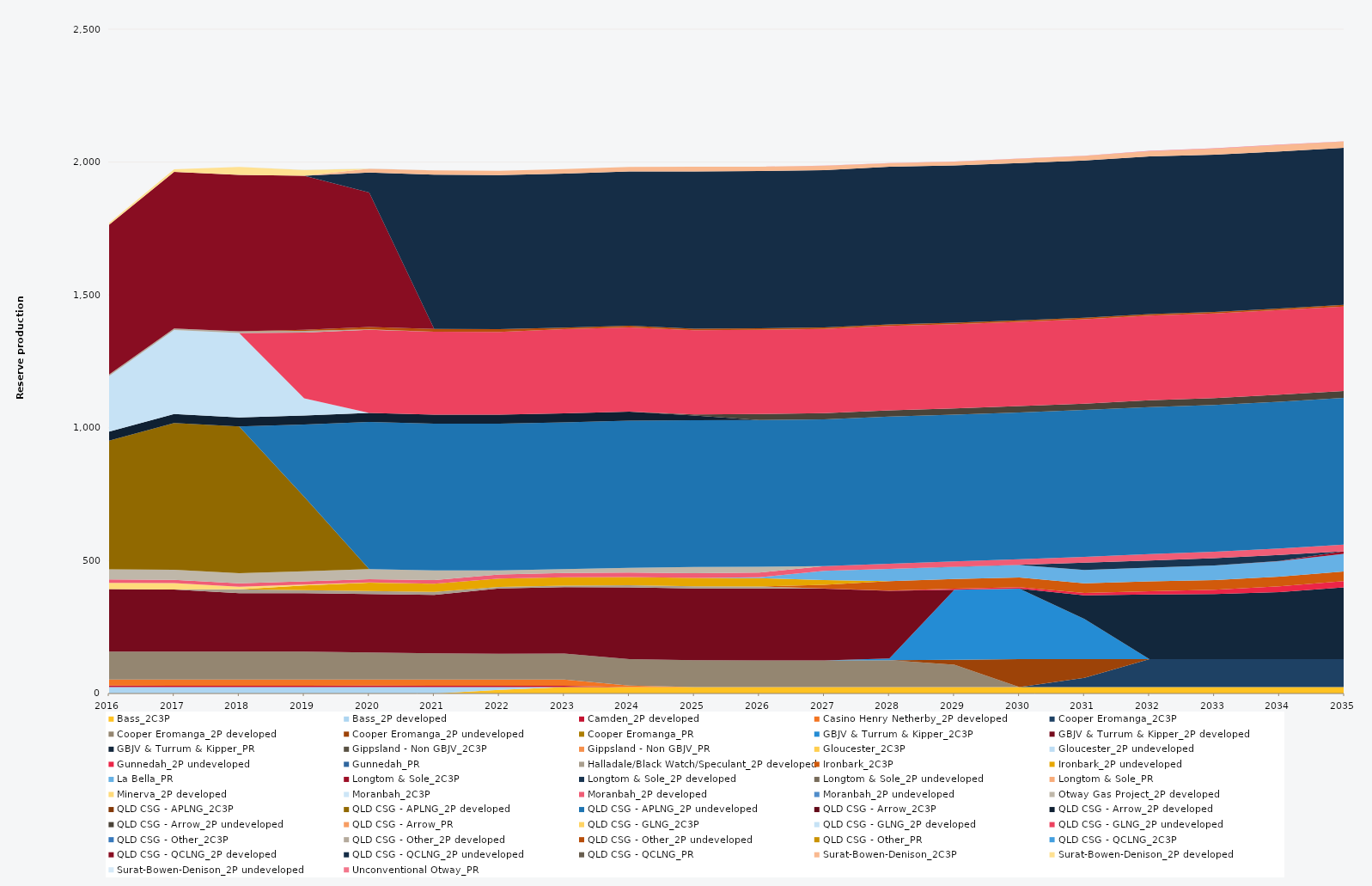
| Category | Bass_2C3P | Bass_2P developed | Camden_2P developed | Casino Henry Netherby_2P developed | Cooper Eromanga_2C3P | Cooper Eromanga_2P developed | Cooper Eromanga_2P undeveloped | Cooper Eromanga_PR | GBJV & Turrum & Kipper_2C3P | GBJV & Turrum & Kipper_2P developed | GBJV & Turrum & Kipper_PR | Gippsland - Non GBJV_2C3P | Gippsland - Non GBJV_PR | Gloucester_2C3P | Gloucester_2P undeveloped | Gunnedah_2P undeveloped | Gunnedah_PR | Halladale/Black Watch/Speculant_2P developed | Ironbark_2C3P | Ironbark_2P undeveloped | La Bella_PR | Longtom & Sole_2C3P | Longtom & Sole_2P developed | Longtom & Sole_2P undeveloped | Longtom & Sole_PR | Minerva_2P developed | Moranbah_2C3P | Moranbah_2P developed | Moranbah_2P undeveloped | Otway Gas Project_2P developed | QLD CSG - APLNG_2C3P | QLD CSG - APLNG_2P developed | QLD CSG - APLNG_2P undeveloped | QLD CSG - Arrow_2C3P | QLD CSG - Arrow_2P developed | QLD CSG - Arrow_2P undeveloped | QLD CSG - Arrow_PR | QLD CSG - GLNG_2C3P | QLD CSG - GLNG_2P developed | QLD CSG - GLNG_2P undeveloped | QLD CSG - Other_2C3P | QLD CSG - Other_2P developed | QLD CSG - Other_2P undeveloped | QLD CSG - Other_PR | QLD CSG - QCLNG_2C3P | QLD CSG - QCLNG_2P developed | QLD CSG - QCLNG_2P undeveloped | QLD CSG - QCLNG_PR | Surat-Bowen-Denison_2C3P | Surat-Bowen-Denison_2P developed | Surat-Bowen-Denison_2P undeveloped | Unconventional Otway_PR |
|---|---|---|---|---|---|---|---|---|---|---|---|---|---|---|---|---|---|---|---|---|---|---|---|---|---|---|---|---|---|---|---|---|---|---|---|---|---|---|---|---|---|---|---|---|---|---|---|---|---|---|---|---|
| 2016 | 0 | 24.522 | 5 | 23.12 | 0 | 105 | 0 | 0 | 0 | 235.041 | 0 | 0 | 0 | 0 | 0 | 0 | 0 | 0 | 0 | 0 | 0 | 0 | 0 | 0 | 0 | 23.79 | 0 | 12.859 | 0 | 38 | 0 | 484.594 | 0 | 0 | 34.038 | 0 | 0 | 0 | 209.001 | 0 | 0 | 5.856 | 0 | 0 | 0 | 563.547 | 0 | 0 | 0 | 5.945 | 0 | 0 |
| 2017 | 0 | 24.455 | 5 | 23.12 | 0 | 105 | 0 | 0 | 0 | 233.892 | 0 | 0 | 0 | 0 | 0 | 0 | 0 | 0 | 0 | 0 | 0 | 0 | 0 | 0 | 0 | 23.725 | 0 | 12.863 | 0 | 38 | 0 | 552.245 | 0 | 0 | 33.945 | 0 | 0 | 0 | 315.709 | 0 | 0 | 5.84 | 0 | 0 | 0 | 589.493 | 0 | 0 | 0 | 9.566 | 0 | 0 |
| 2018 | 0 | 24.455 | 5 | 23.12 | 0 | 105 | 0 | 0 | 0 | 220 | 0 | 0 | 0 | 0 | 0 | 0 | 0 | 14.421 | 0 | 0 | 0 | 0 | 0 | 0 | 0 | 9.902 | 0 | 13.029 | 0 | 38 | 0 | 552.245 | 0 | 0 | 33.945 | 0 | 0 | 0 | 317.904 | 0 | 0 | 5.84 | 0 | 0 | 0 | 588.867 | 0 | 0 | 0 | 30 | 0 | 0 |
| 2019 | 0 | 24.455 | 5 | 23.12 | 0 | 105 | 0 | 0 | 0 | 220 | 0 | 0 | 0 | 0 | 0 | 0 | 0 | 10.95 | 0 | 18.25 | 0 | 0 | 0 | 0 | 0 | 2.858 | 0 | 12.796 | 0 | 38 | 0 | 280.466 | 271.779 | 0 | 33.945 | 0 | 0 | 0 | 64.686 | 247.352 | 0 | 5.84 | 4.563 | 0 | 0 | 579.711 | 0 | 0 | 0 | 21.304 | 0.833 | 0 |
| 2020 | 0 | 24.522 | 5 | 23.12 | 0 | 101.977 | 0 | 0 | 0 | 220 | 0 | 0 | 0 | 0 | 0 | 0 | 0 | 10.95 | 0 | 31.587 | 0 | 0 | 0 | 0 | 0 | 0.475 | 0 | 12.768 | 0 | 38 | 0 | 0 | 553.758 | 0 | 34.038 | 0 | 0 | 0 | 0 | 312.824 | 0 | 1.624 | 8.795 | 0 | 0 | 505.782 | 75.66 | 0 | 14.093 | 0 | 1.167 | 0 |
| 2021 | 0 | 24.455 | 5 | 23.12 | 0 | 98.518 | 0 | 0 | 0 | 220 | 0 | 0 | 0 | 0 | 0 | 0 | 0 | 10.95 | 0 | 31.51 | 0 | 0 | 0 | 0 | 0 | 0 | 0 | 13.526 | 0 | 36.482 | 0 | 0 | 552.245 | 0 | 33.945 | 0 | 0 | 0 | 0 | 311.967 | 0 | 0 | 10.403 | 0 | 0 | 0 | 580.143 | 0 | 16.54 | 0 | 0 | 0 |
| 2022 | 13.672 | 10.783 | 5 | 23.12 | 0 | 96.855 | 0 | 0 | 0 | 245.927 | 0 | 0 | 0 | 0 | 0 | 0 | 0 | 5.702 | 0 | 31.391 | 0 | 0 | 0 | 0 | 0 | 0 | 0 | 15.305 | 0 | 15.24 | 0 | 0 | 552.245 | 0 | 33.945 | 0 | 0 | 0 | 0 | 311.905 | 0 | 0 | 10.403 | 0 | 0 | 0 | 579.646 | 0 | 16.273 | 0 | 0 | 0 |
| 2023 | 24.455 | 0 | 5 | 23.12 | 0 | 97.871 | 0 | 0 | 0 | 249.552 | 0 | 0 | 0 | 0 | 0 | 0 | 0 | 5.676 | 0 | 31.38 | 0 | 0 | 0 | 0 | 0 | 0 | 0 | 16.282 | 0 | 14.891 | 0 | 0 | 552.245 | 0 | 33.945 | 0 | 0 | 0 | 0 | 316.633 | 0 | 0 | 5.84 | 0 | 0 | 0 | 579.627 | 0 | 16.783 | 0 | 0 | 0 |
| 2024 | 24.522 | 0 | 0 | 5.3 | 0 | 99.942 | 0 | 0 | 0 | 270 | 0 | 0 | 0 | 0 | 0 | 0 | 0 | 7.629 | 0 | 31.066 | 0 | 0 | 0 | 0 | 0 | 0 | 0 | 16.806 | 0 | 17.598 | 0 | 0 | 553.758 | 0 | 34.038 | 0 | 0 | 0 | 0 | 317.367 | 0 | 0 | 5.856 | 0 | 0 | 0 | 580.633 | 0 | 17.31 | 0 | 0 | 0 |
| 2025 | 24.455 | 0 | 0 | 0 | 0 | 100.749 | 0 | 0 | 0 | 270 | 0 | 0 | 0 | 0 | 0 | 0.116 | 0 | 8.483 | 0 | 31.419 | 0 | 0 | 0 | 0 | 0 | 0 | 0 | 17.285 | 0 | 23.555 | 0 | 0 | 552.245 | 0 | 18.166 | 3.911 | 0 | 0 | 0 | 316.806 | 0 | 0 | 5.84 | 0 | 0 | 0 | 591.794 | 0 | 18.03 | 0 | 0 | 0 |
| 2026 | 24.455 | 0 | 0 | 0 | 0 | 100.411 | 0 | 0 | 0 | 270 | 0 | 0 | 0 | 0 | 0 | 0.255 | 0 | 7.239 | 0 | 31.425 | 3.836 | 0 | 0 | 0 | 0 | 0 | 0 | 17.534 | 0 | 21.841 | 0 | 0 | 552.245 | 0 | 0 | 22.876 | 0 | 0 | 0 | 316.704 | 0 | 0 | 5.84 | 0 | 0 | 0 | 591.753 | 0 | 15.837 | 0 | 0 | 0 |
| 2027 | 24.455 | 0 | 0 | 0 | 0 | 100.276 | 0 | 0 | 0 | 270 | 0 | 0 | 0 | 0 | 0 | 0.725 | 0 | 0 | 13.563 | 17.972 | 34.637 | 0 | 0 | 0 | 0 | 0 | 0 | 18.159 | 0 | 0 | 0 | 0 | 552.245 | 0 | 0 | 23.167 | 0 | 0 | 0 | 316.867 | 0 | 0 | 5.84 | 0 | 0 | 0 | 591.694 | 0 | 16.247 | 0 | 0 | 0.834 |
| 2028 | 24.522 | 0 | 0 | 0 | 0 | 100.609 | 0 | 0 | 6.395 | 254.696 | 0 | 0 | 0 | 0 | 0 | 1.261 | 0 | 0 | 35.754 | 0 | 45.94 | 0 | 0 | 0 | 0 | 0 | 0 | 19.008 | 0 | 0 | 0 | 0 | 553.758 | 0 | 0 | 23.513 | 0 | 0 | 0 | 317.838 | 0 | 0 | 5.856 | 0 | 0 | 0 | 593.235 | 0 | 13.159 | 0 | 0 | 1.077 |
| 2029 | 24.455 | 0 | 0 | 0 | 0 | 83.791 | 19.067 | 0 | 263.426 | 0 | 0 | 0 | 0 | 0 | 0 | 3.505 | 0 | 0 | 36.5 | 0 | 45.453 | 0 | 0.639 | 0 | 0 | 0 | 0 | 20.36 | 0 | 0 | 0 | 0 | 552.245 | 0 | 0 | 23.397 | 0 | 0 | 0 | 316.91 | 0 | 0 | 5.84 | 0 | 0 | 0 | 591.622 | 0 | 13.566 | 0 | 0 | 1.283 |
| 2030 | 24.455 | 0 | 0 | 0 | 0 | 0 | 105 | 0 | 265.076 | 0 | 0 | 0 | 0 | 0 | 0 | 5.326 | 0 | 0 | 36.5 | 0 | 46.948 | 0 | 0.73 | 0 | 0 | 0 | 0 | 21.622 | 0 | 0 | 0 | 0 | 552.245 | 0 | 0 | 23.644 | 0 | 0 | 0 | 317.293 | 0 | 0 | 5.84 | 0 | 0 | 0 | 591.579 | 0 | 15.96 | 0 | 0 | 1.339 |
| 2031 | 24.455 | 0 | 0 | 0 | 34.485 | 0 | 70.515 | 0 | 150.817 | 0 | 89.618 | 0 | 0 | 0 | 0 | 8.705 | 0 | 0 | 36.5 | 0 | 49.585 | 0 | 27.375 | 0 | 0 | 0 | 0 | 22.567 | 0 | 0 | 0 | 0 | 552.245 | 0 | 0 | 24.211 | 0 | 0 | 0 | 317.568 | 0 | 0 | 5.84 | 0 | 0 | 0 | 591.53 | 0 | 16.681 | 0 | 0 | 0.772 |
| 2032 | 24.522 | 0 | 0 | 0 | 105 | 0 | 0 | 0 | 0 | 0 | 243.268 | 0 | 0 | 0 | 0 | 12.378 | 0 | 0 | 36.6 | 0 | 51.643 | 0 | 27.45 | 0 | 0 | 0 | 0 | 23.484 | 0 | 0 | 0 | 0 | 553.758 | 0 | 0 | 25.31 | 0 | 0 | 0 | 318.7 | 0 | 0 | 5.856 | 0 | 0 | 0 | 593.07 | 0 | 19.764 | 0 | 0 | 1.328 |
| 2033 | 24.455 | 0 | 0 | 0 | 105 | 0 | 0 | 0 | 0 | 0 | 244.715 | 0 | 0 | 0 | 0 | 16.159 | 0 | 0 | 36.5 | 0 | 55.219 | 0 | 27.375 | 0 | 0 | 0 | 0 | 23.992 | 0 | 0 | 0 | 0 | 552.245 | 0 | 0 | 26.325 | 0 | 0 | 0 | 318.169 | 0 | 0 | 5.84 | 0 | 0 | 0 | 591.435 | 0 | 22.846 | 0 | 0 | 1.739 |
| 2034 | 24.455 | 0 | 0 | 0 | 105 | 0 | 0 | 0 | 0 | 0 | 252.516 | 0 | 0 | 0 | 0 | 21.553 | 0 | 0 | 36.5 | 0 | 58.382 | 0.061 | 22.914 | 0 | 0 | 0 | 0 | 24.563 | 0 | 0 | 0 | 0 | 552.245 | 0 | 0 | 26.511 | 0 | 0 | 0 | 318.356 | 0 | 0 | 5.84 | 0 | 0 | 0 | 591.394 | 0 | 23.74 | 0 | 0 | 1.71 |
| 2035 | 24.455 | 0 | 0 | 0 | 105 | 0 | 0 | 0 | 0 | 0 | 270 | 0 | 0 | 0 | 0 | 23.754 | 0 | 0 | 36.5 | 0 | 66.374 | 9.338 | 0 | 0 | 0 | 0 | 0 | 24.813 | 0 | 0 | 0 | 0 | 552.245 | 0 | 0 | 26.426 | 0 | 0 | 0 | 317.84 | 0 | 0 | 5.84 | 0 | 0 | 0 | 591.053 | 0 | 23.872 | 0 | 0 | 0.918 |